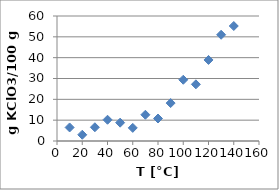
| Category | Series 0 |
|---|---|
| 10.0 | 6.5 |
| 20.0 | 3 |
| 30.0 | 6.6 |
| 40.0 | 10.2 |
| 50.0 | 8.8 |
| 60.0 | 6.3 |
| 70.0 | 12.6 |
| 80.0 | 10.8 |
| 90.0 | 18.2 |
| 100.0 | 29.4 |
| 110.0 | 27.2 |
| 120.0 | 38.9 |
| 130.0 | 51 |
| 140.0 | 55.2 |